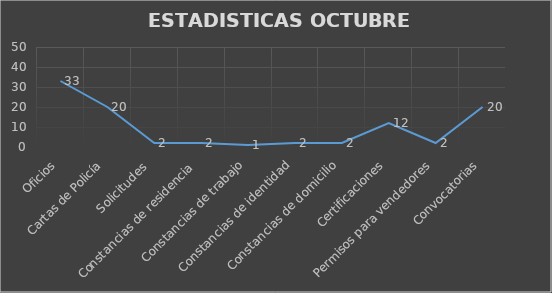
| Category | CANTIDAD |
|---|---|
| Oficios | 33 |
| Cartas de Policía | 20 |
| Solicitudes  | 2 |
| Constancias de residencia  | 2 |
| Constancias de trabajo | 1 |
| Constancias de identidad | 2 |
| Constancias de domicilio | 2 |
| Certificaciones | 12 |
| Permisos para vendedores | 2 |
| Convocatorias | 20 |